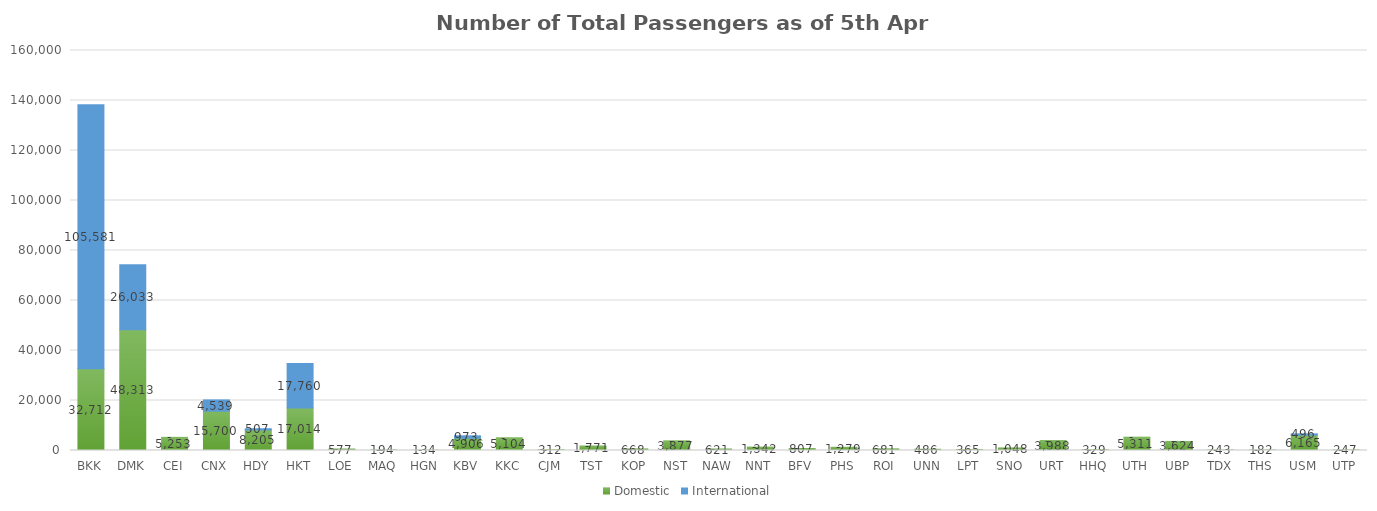
| Category | Domestic | International |
|---|---|---|
| BKK | 32712 | 105581 |
| DMK | 48313 | 26033 |
| CEI | 5253 | 0 |
| CNX | 15700 | 4539 |
| HDY | 8205 | 507 |
| HKT | 17014 | 17760 |
| LOE | 577 | 0 |
| MAQ | 194 | 0 |
| HGN | 134 | 0 |
| KBV | 4906 | 973 |
| KKC | 5104 | 0 |
| CJM | 312 | 0 |
| TST | 1771 | 0 |
| KOP | 668 | 0 |
| NST | 3877 | 0 |
| NAW | 621 | 0 |
| NNT | 1342 | 0 |
| BFV | 807 | 0 |
| PHS | 1279 | 0 |
| ROI | 681 | 0 |
| UNN | 486 | 0 |
| LPT | 365 | 0 |
| SNO | 1048 | 0 |
| URT | 3988 | 0 |
| HHQ | 329 | 0 |
| UTH | 5311 | 0 |
| UBP | 3624 | 0 |
| TDX | 243 | 0 |
| THS | 182 | 0 |
| USM | 6165 | 496 |
| UTP | 247 | 0 |